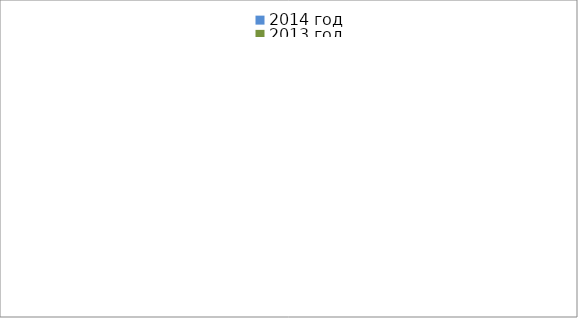
| Category | 2014 год | 2013 год |
|---|---|---|
|  - поджог | 21 | 34 |
|  - неосторожное обращение с огнём | 46 | 56 |
|  - НПТЭ электрооборудования | 18 | 22 |
|  - НПУ и Э печей | 65 | 53 |
|  - НПУ и Э транспортных средств | 58 | 53 |
|   -Шалость с огнем детей | 1 | 3 |
|  -НППБ при эксплуатации эл.приборов | 19 | 26 |
|  - курение | 20 | 12 |
| - прочие | 82 | 78 |
| - не установленные причины | 8 | 2 |